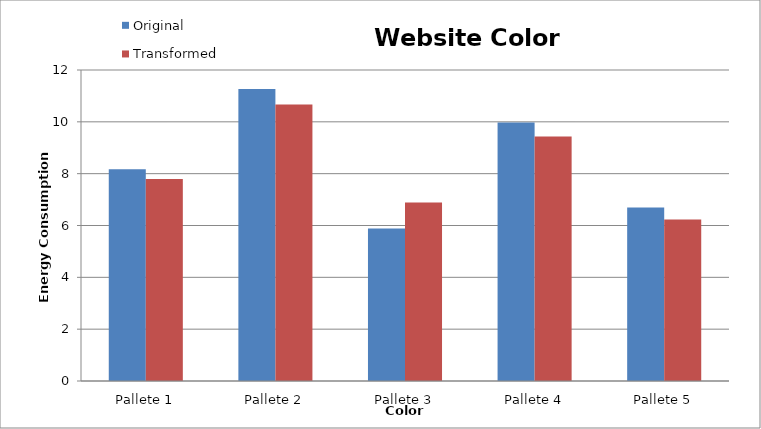
| Category | Original | Transformed |
|---|---|---|
| Pallete 1 | 8.175 | 7.79 |
| Pallete 2 | 11.27 | 10.67 |
| Pallete 3 | 5.88 | 6.89 |
| Pallete 4 | 9.97 | 9.43 |
| Pallete 5 | 6.69 | 6.23 |